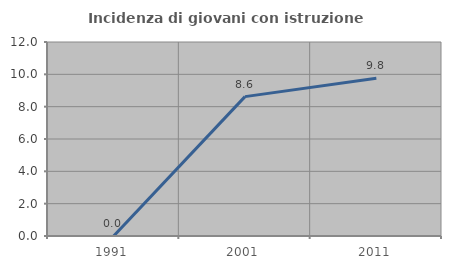
| Category | Incidenza di giovani con istruzione universitaria |
|---|---|
| 1991.0 | 0 |
| 2001.0 | 8.621 |
| 2011.0 | 9.756 |